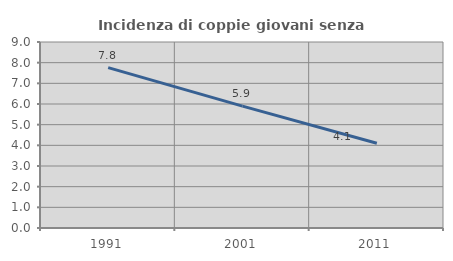
| Category | Incidenza di coppie giovani senza figli |
|---|---|
| 1991.0 | 7.758 |
| 2001.0 | 5.899 |
| 2011.0 | 4.103 |